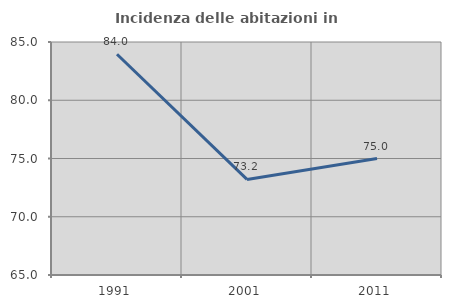
| Category | Incidenza delle abitazioni in proprietà  |
|---|---|
| 1991.0 | 83.952 |
| 2001.0 | 73.205 |
| 2011.0 | 75 |